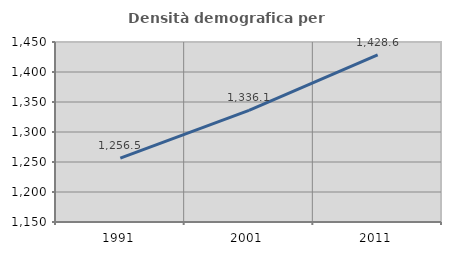
| Category | Densità demografica |
|---|---|
| 1991.0 | 1256.492 |
| 2001.0 | 1336.059 |
| 2011.0 | 1428.611 |